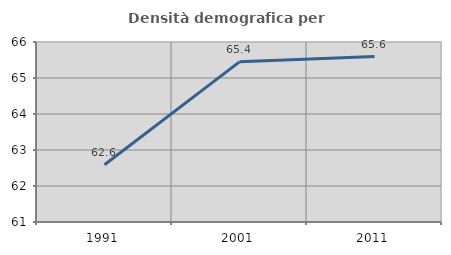
| Category | Densità demografica |
|---|---|
| 1991.0 | 62.592 |
| 2001.0 | 65.449 |
| 2011.0 | 65.594 |